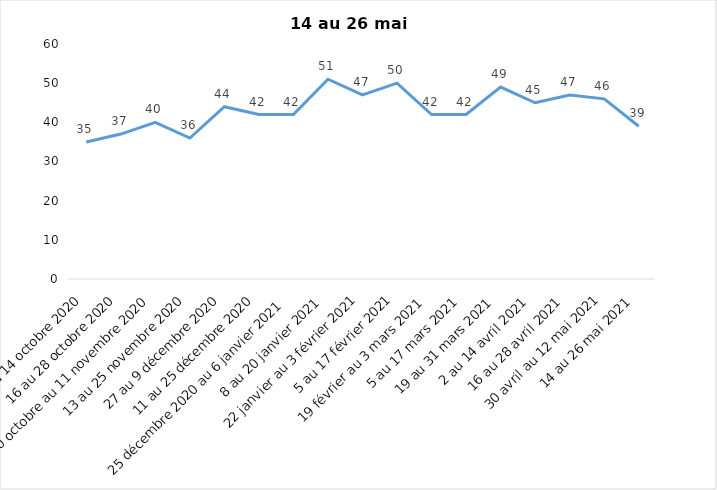
| Category | Toujours aux trois mesures |
|---|---|
| 2 au 14 octobre 2020 | 35 |
| 16 au 28 octobre 2020 | 37 |
| 30 octobre au 11 novembre 2020 | 40 |
| 13 au 25 novembre 2020 | 36 |
| 27 au 9 décembre 2020 | 44 |
| 11 au 25 décembre 2020 | 42 |
| 25 décembre 2020 au 6 janvier 2021 | 42 |
| 8 au 20 janvier 2021 | 51 |
| 22 janvier au 3 février 2021 | 47 |
| 5 au 17 février 2021 | 50 |
| 19 février au 3 mars 2021 | 42 |
| 5 au 17 mars 2021 | 42 |
| 19 au 31 mars 2021 | 49 |
| 2 au 14 avril 2021 | 45 |
| 16 au 28 avril 2021 | 47 |
| 30 avril au 12 mai 2021 | 46 |
| 14 au 26 mai 2021 | 39 |